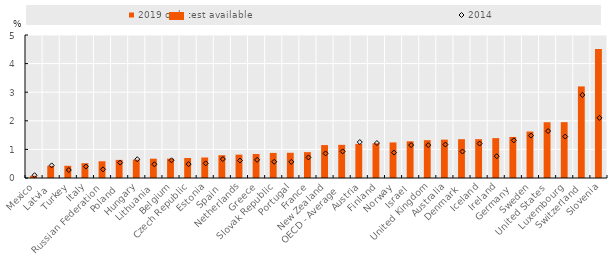
| Category | 2019 or latest available |
|---|---|
| Mexico | 0.078 |
| Latvia | 0.425 |
| Turkey | 0.427 |
| Italy | 0.517 |
| Russian Federation | 0.586 |
| Poland | 0.634 |
| Hungary | 0.641 |
| Lithuania | 0.675 |
| Belgium | 0.676 |
| Czech Republic | 0.7 |
| Estonia | 0.717 |
| Spain | 0.797 |
| Netherlands | 0.816 |
| Greece | 0.839 |
| Slovak Republic | 0.877 |
| Portugal | 0.882 |
| France | 0.904 |
| New Zealand | 1.152 |
| OECD - Average | 1.159 |
| Austria | 1.192 |
| Finland | 1.213 |
| Norway | 1.244 |
| Israel | 1.283 |
| United Kingdom | 1.323 |
| Australia | 1.341 |
| Denmark | 1.357 |
| Iceland | 1.358 |
| Ireland | 1.394 |
| Germany | 1.435 |
| Sweden | 1.625 |
| United States | 1.95 |
| Luxembourg | 1.953 |
| Switzerland | 3.203 |
| Slovenia | 4.507 |